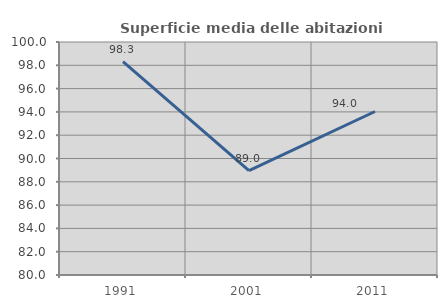
| Category | Superficie media delle abitazioni occupate |
|---|---|
| 1991.0 | 98.325 |
| 2001.0 | 88.963 |
| 2011.0 | 94.035 |